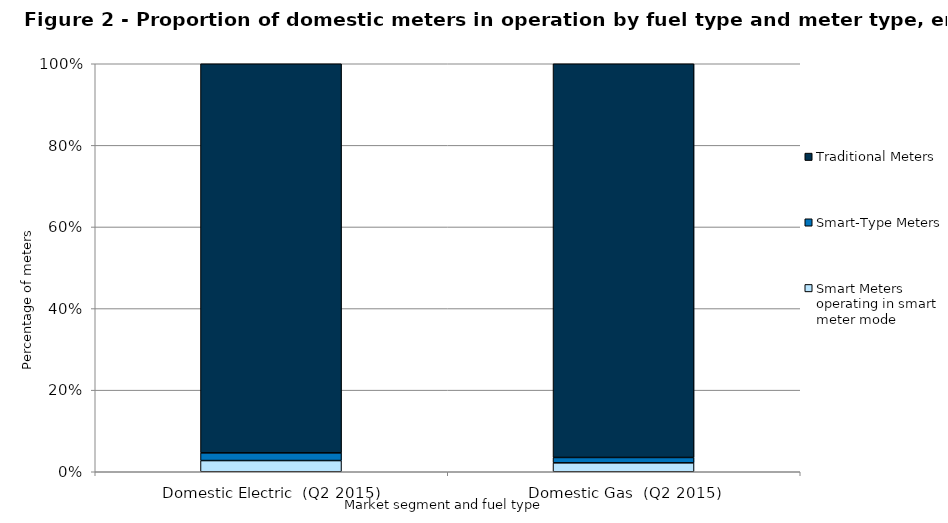
| Category | Smart Meters operating in smart meter mode | Smart-Type Meters | Traditional Meters |
|---|---|---|---|
| Domestic Electric  (Q2 2015) | 719368 | 494633 | 24997685 |
| Domestic Gas  (Q2 2015) | 473819 | 285697 | 20929480 |